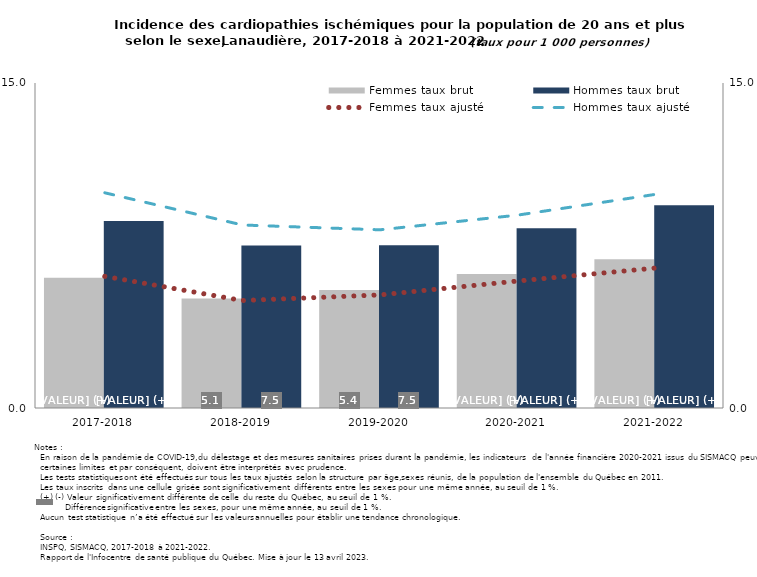
| Category | Femmes taux brut | Hommes taux brut |
|---|---|---|
| 2017-2018 | 6.017 | 8.632 |
| 2018-2019 | 5.058 | 7.497 |
| 2019-2020 | 5.443 | 7.508 |
| 2020-2021 | 6.185 | 8.302 |
| 2021-2022 | 6.865 | 9.363 |